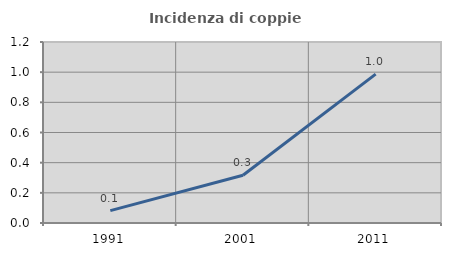
| Category | Incidenza di coppie miste |
|---|---|
| 1991.0 | 0.082 |
| 2001.0 | 0.317 |
| 2011.0 | 0.987 |